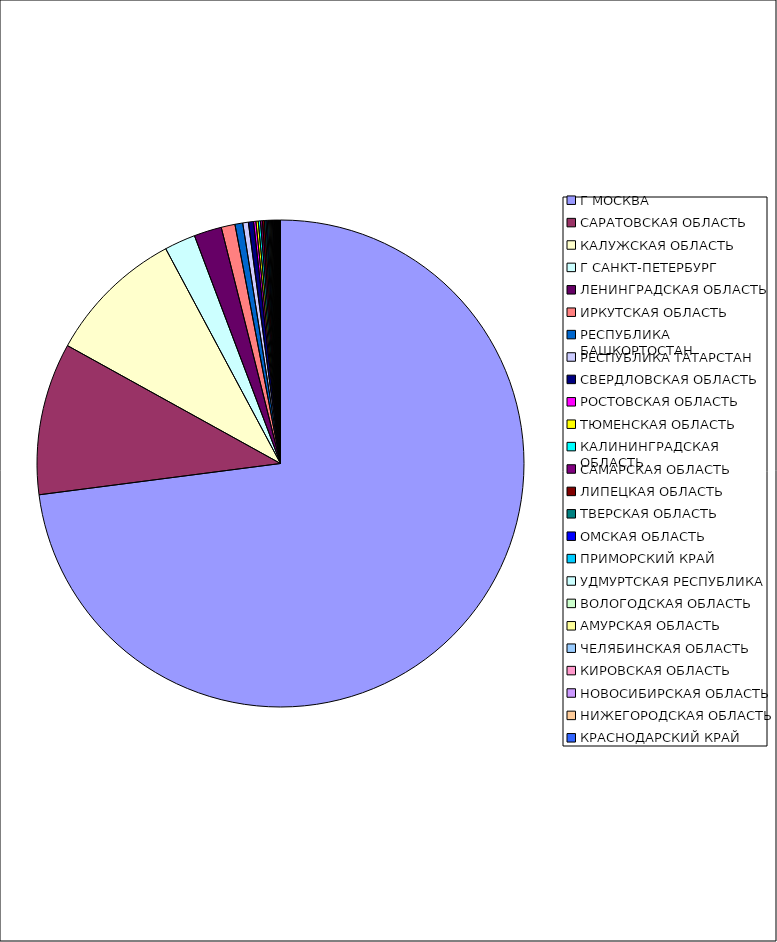
| Category | Оборот |
|---|---|
| Г МОСКВА | 0.729 |
| САРАТОВСКАЯ ОБЛАСТЬ | 0.101 |
| КАЛУЖСКАЯ ОБЛАСТЬ | 0.091 |
| Г САНКТ-ПЕТЕРБУРГ | 0.021 |
| ЛЕНИНГРАДСКАЯ ОБЛАСТЬ | 0.018 |
| ИРКУТСКАЯ ОБЛАСТЬ | 0.009 |
| РЕСПУБЛИКА БАШКОРТОСТАН | 0.005 |
| РЕСПУБЛИКА ТАТАРСТАН | 0.004 |
| СВЕРДЛОВСКАЯ ОБЛАСТЬ | 0.003 |
| РОСТОВСКАЯ ОБЛАСТЬ | 0.002 |
| ТЮМЕНСКАЯ ОБЛАСТЬ | 0.002 |
| КАЛИНИНГРАДСКАЯ ОБЛАСТЬ | 0.001 |
| САМАРСКАЯ ОБЛАСТЬ | 0.001 |
| ЛИПЕЦКАЯ ОБЛАСТЬ | 0.001 |
| ТВЕРСКАЯ ОБЛАСТЬ | 0.001 |
| ОМСКАЯ ОБЛАСТЬ | 0.001 |
| ПРИМОРСКИЙ КРАЙ | 0.001 |
| УДМУРТСКАЯ РЕСПУБЛИКА | 0.001 |
| ВОЛОГОДСКАЯ ОБЛАСТЬ | 0.001 |
| АМУРСКАЯ ОБЛАСТЬ | 0.001 |
| ЧЕЛЯБИНСКАЯ ОБЛАСТЬ | 0.001 |
| КИРОВСКАЯ ОБЛАСТЬ | 0 |
| НОВОСИБИРСКАЯ ОБЛАСТЬ | 0 |
| НИЖЕГОРОДСКАЯ ОБЛАСТЬ | 0 |
| КРАСНОДАРСКИЙ КРАЙ | 0 |
| КРАСНОЯРСКИЙ КРАЙ | 0 |
| РЕСПУБЛИКА ДАГЕСТАН | 0 |
| ИВАНОВСКАЯ ОБЛАСТЬ | 0 |
| РЕСПУБЛИКА МОРДОВИЯ | 0 |
| РЯЗАНСКАЯ ОБЛАСТЬ | 0 |
| ОРЕНБУРГСКАЯ ОБЛАСТЬ | 0 |
| РЕСПУБЛИКА САХА(ЯКУТИЯ) | 0 |
| СТАВРОПОЛЬСКИЙ КРАЙ | 0 |
| РЕСПУБЛИКА КОМИ | 0 |
| ТУЛЬСКАЯ ОБЛАСТЬ | 0 |
| КУРСКАЯ ОБЛАСТЬ | 0 |
| БЕЛГОРОДСКАЯ ОБЛАСТЬ | 0 |
| ПСКОВСКАЯ ОБЛАСТЬ | 0 |
| СМОЛЕНСКАЯ ОБЛАСТЬ | 0 |
| АЛТАЙСКИЙ КРАЙ | 0 |
| ПЕРМСКИЙ КРАЙ | 0 |
| ЯРОСЛАВСКАЯ ОБЛАСТЬ | 0 |
| КАБАРДИНО-БАЛКАРСКАЯ РЕСПУБЛИКА | 0 |
| МОСКОВСКАЯ ОБЛАСТЬ | 0 |
| ВОЛГОГРАДСКАЯ ОБЛАСТЬ | 0 |
| КЕМЕРОВСКАЯ ОБЛАСТЬ | 0 |